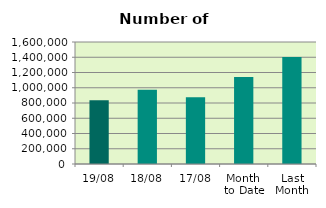
| Category | Series 0 |
|---|---|
| 19/08 | 837178 |
| 18/08 | 972398 |
| 17/08 | 876484 |
| Month 
to Date | 1141705.231 |
| Last
Month | 1404253.739 |